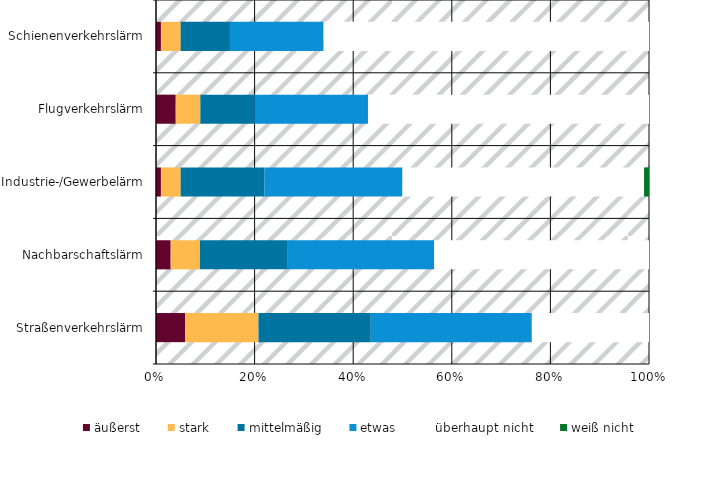
| Category | äußerst | stark | mittelmäßig | etwas | überhaupt nicht | weiß nicht |
|---|---|---|---|---|---|---|
| Straßenverkehrslärm | 0.06 | 0.15 | 0.23 | 0.33 | 0.24 | 0 |
| Nachbarschaftslärm | 0.03 | 0.06 | 0.18 | 0.3 | 0.44 | 0 |
| Industrie-/Gewerbelärm | 0.01 | 0.04 | 0.17 | 0.28 | 0.49 | 0.01 |
| Flugverkehrslärm | 0.04 | 0.05 | 0.11 | 0.23 | 0.57 | 0 |
| Schienenverkehrslärm | 0.01 | 0.04 | 0.1 | 0.19 | 0.66 | 0 |